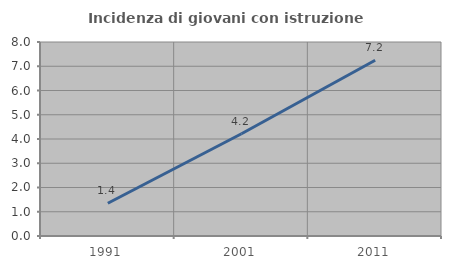
| Category | Incidenza di giovani con istruzione universitaria |
|---|---|
| 1991.0 | 1.351 |
| 2001.0 | 4.217 |
| 2011.0 | 7.246 |